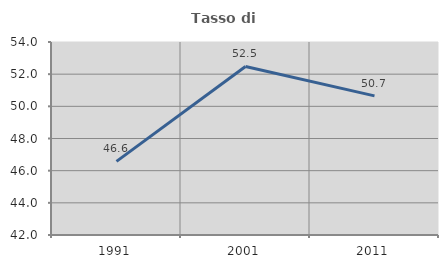
| Category | Tasso di occupazione   |
|---|---|
| 1991.0 | 46.575 |
| 2001.0 | 52.482 |
| 2011.0 | 50.651 |